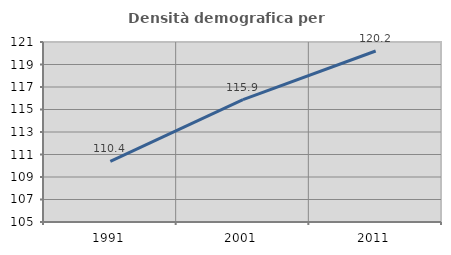
| Category | Densità demografica |
|---|---|
| 1991.0 | 110.381 |
| 2001.0 | 115.882 |
| 2011.0 | 120.2 |